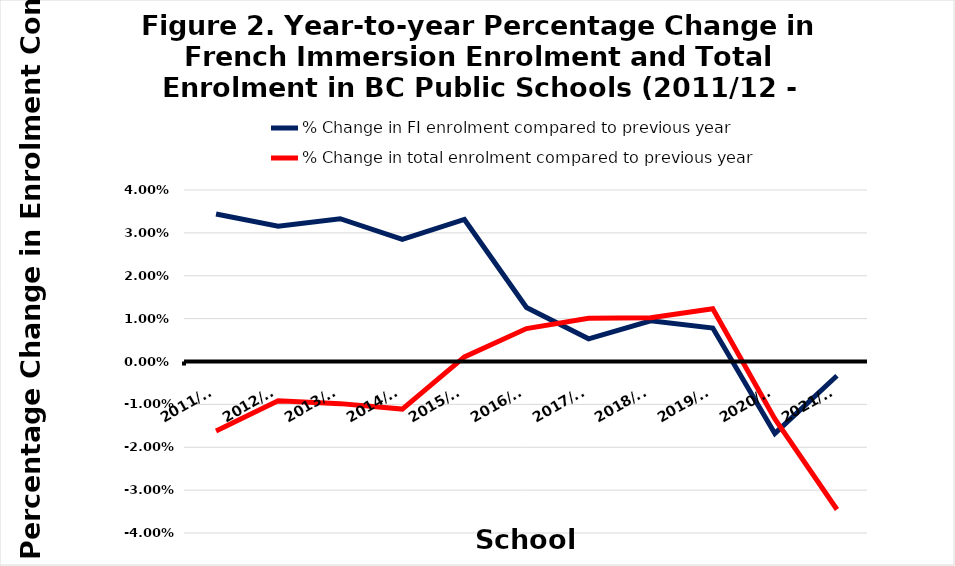
| Category | % Change in FI enrolment compared to previous year  | % Change in total enrolment compared to previous year  |
|---|---|---|
| 2011/12 | 0.034 | -0.016 |
| 2012/13 | 0.032 | -0.009 |
| 2013/14 | 0.033 | -0.01 |
| 2014/15 | 0.028 | -0.011 |
| 2015/16 | 0.033 | 0.001 |
| 2016/17 | 0.013 | 0.008 |
| 2017/18 | 0.005 | 0.01 |
| 2018/19 | 0.009 | 0.01 |
| 2019/20 | 0.008 | 0.012 |
| 2020/21 | -0.017 | -0.013 |
| 2021/22 | -0.003 | -0.035 |